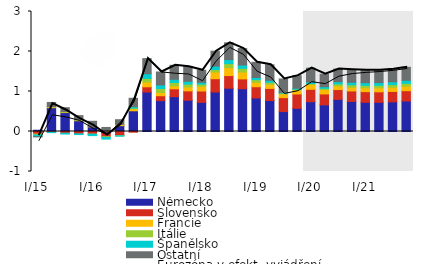
| Category | Německo | Slovensko | Francie | Itálie | Španělsko | Ostatní |
|---|---|---|---|---|---|---|
| I/15 | 0.032 | -0.063 | -0.016 | -0.007 | -0.042 | -0.005 |
| II | 0.595 | -0.015 | 0.021 | 0.007 | -0.013 | 0.103 |
| III | 0.473 | -0.043 | 0.009 | 0.017 | -0.021 | 0.096 |
| IV | 0.269 | -0.058 | 0.015 | 0.01 | -0.019 | 0.102 |
| I/16 | 0.117 | -0.066 | 0.007 | -0.002 | -0.034 | 0.131 |
| II | -0.04 | -0.091 | 0.007 | -0.016 | -0.044 | 0.095 |
| III | 0.146 | -0.102 | 0.032 | -0.005 | -0.01 | 0.118 |
| IV | 0.518 | -0.017 | 0.053 | 0.015 | 0.036 | 0.209 |
| I/17 | 0.987 | 0.131 | 0.118 | 0.09 | 0.118 | 0.378 |
| II | 0.772 | 0.122 | 0.082 | 0.1 | 0.089 | 0.324 |
| III | 0.871 | 0.197 | 0.074 | 0.083 | 0.081 | 0.349 |
| IV | 0.782 | 0.234 | 0.097 | 0.072 | 0.07 | 0.364 |
| I/18 | 0.729 | 0.284 | 0.119 | 0.052 | 0.046 | 0.301 |
| II | 0.986 | 0.334 | 0.168 | 0.062 | 0.083 | 0.375 |
| III | 1.082 | 0.316 | 0.199 | 0.1 | 0.102 | 0.419 |
| IV | 1.07 | 0.246 | 0.172 | 0.093 | 0.082 | 0.412 |
| I/19 | 0.838 | 0.281 | 0.112 | 0.065 | 0.055 | 0.379 |
| II | 0.774 | 0.303 | 0.102 | 0.051 | 0.048 | 0.389 |
| III | 0.498 | 0.348 | 0.094 | 0.018 | 0.02 | 0.335 |
| IV | 0.58 | 0.358 | 0.099 | 0.018 | 0.025 | 0.315 |
| I/20 | 0.745 | 0.31 | 0.12 | 0.025 | 0.04 | 0.344 |
| II | 0.666 | 0.274 | 0.107 | 0.032 | 0.041 | 0.311 |
| III | 0.803 | 0.245 | 0.094 | 0.047 | 0.056 | 0.316 |
| IV | 0.752 | 0.262 | 0.093 | 0.061 | 0.063 | 0.312 |
| I/21 | 0.73 | 0.266 | 0.096 | 0.064 | 0.065 | 0.31 |
| II | 0.73 | 0.263 | 0.1 | 0.063 | 0.067 | 0.31 |
| III | 0.743 | 0.259 | 0.106 | 0.064 | 0.071 | 0.316 |
| IV | 0.763 | 0.258 | 0.114 | 0.069 | 0.076 | 0.325 |